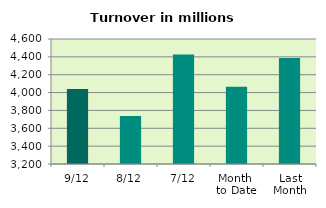
| Category | Series 0 |
|---|---|
| 9/12 | 4039.041 |
| 8/12 | 3737.544 |
| 7/12 | 4426.804 |
| Month 
to Date | 4066.558 |
| Last
Month | 4388.555 |